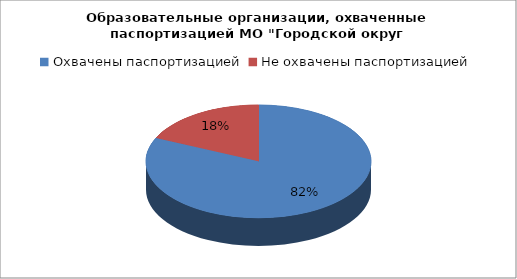
| Category | Series 0 |
|---|---|
| Охвачены паспортизацией  | 81.8 |
| Не охвачены паспортизацией | 18.2 |